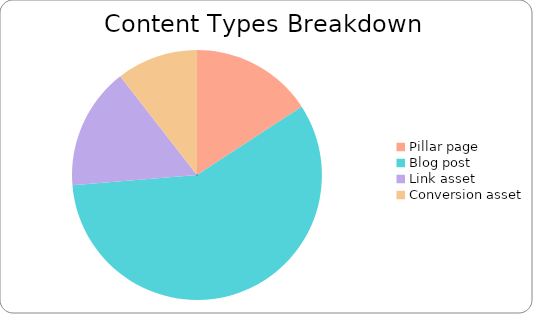
| Category | Count |
|---|---|
| Pillar page | 3 |
| Blog post | 11 |
| Link asset | 3 |
| Conversion asset | 2 |